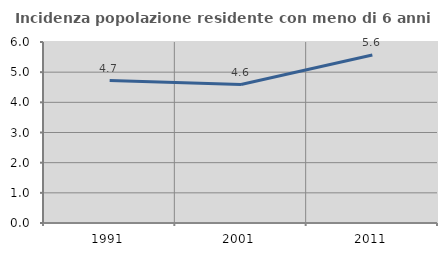
| Category | Incidenza popolazione residente con meno di 6 anni |
|---|---|
| 1991.0 | 4.722 |
| 2001.0 | 4.589 |
| 2011.0 | 5.568 |